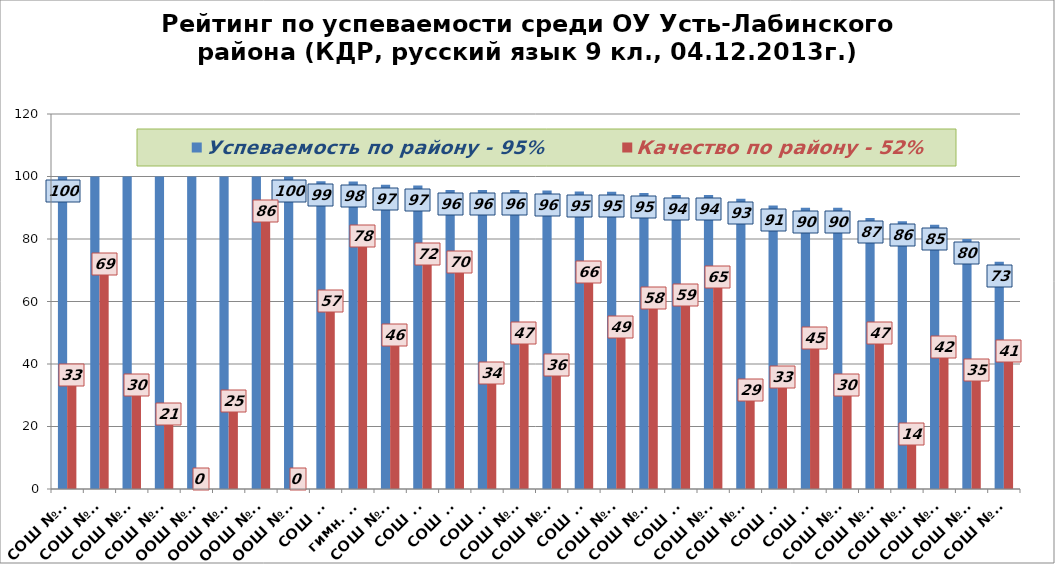
| Category | Успеваемость по району - 95% | Качество по району - 52% |
|---|---|---|
| СОШ №18 | 100 | 33.3 |
| СОШ №19 | 100 | 68.9 |
| СОШ №21 | 100 | 30 |
| СОШ №23 | 100 | 20.7 |
| ООШ №26 | 100 | 0 |
| ООШ №27 | 100 | 25 |
| ООШ №28 | 100 | 85.7 |
| ООШ №31 | 100 | 0 |
| СОШ №6 | 98.5 | 56.9 |
| гимн. №5 | 98.4 | 77.8 |
| СОШ №25 | 97.4 | 46.2 |
| СОШ №2 | 97.1 | 72.1 |
| СОШ №1 | 95.7 | 69.6 |
| СОШ №3 | 95.7 | 34 |
| СОШ №36 | 95.7 | 46.8 |
| СОШ №20 | 95.5 | 36.4 |
| СОШ №7 | 95.2 | 66.1 |
| СОШ №11 | 95.1 | 48.8 |
| СОШ №14 | 94.7 | 57.9 |
| СОШ №9 | 94.1 | 58.8 |
| СОШ №16 | 94.1 | 64.7 |
| СОШ №10 | 92.9 | 28.6 |
| СОШ №4 | 90.7 | 32.6 |
| СОШ №8 | 90 | 45 |
| СОШ №22 | 90 | 30 |
| СОШ №24 | 86.7 | 46.7 |
| СОШ №17 | 85.7 | 14.3 |
| СОШ №13 | 84.6 | 42.3 |
| СОШ №12 | 80 | 35 |
| СОШ №15 | 72.7 | 40.9 |